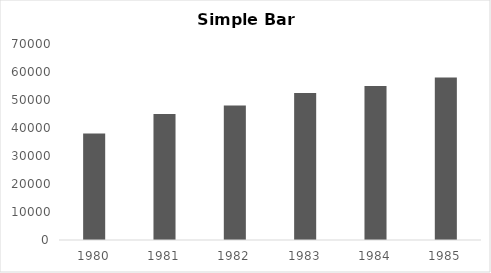
| Category | Profit |
|---|---|
| 1980.0 | 38000 |
| 1981.0 | 45000 |
| 1982.0 | 48000 |
| 1983.0 | 52500 |
| 1984.0 | 55000 |
| 1985.0 | 58000 |